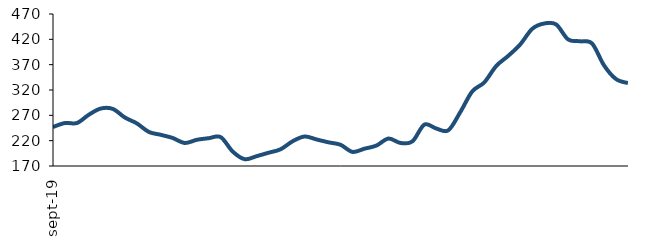
| Category | Series 0 |
|---|---|
| 2019-09-01 | 246.969 |
| 2019-10-01 | 254.848 |
| 2019-11-01 | 254.863 |
| 2019-12-01 | 271.361 |
| 2020-01-01 | 283.496 |
| 2020-02-01 | 282.571 |
| 2020-03-01 | 265.686 |
| 2020-04-01 | 254.092 |
| 2020-05-01 | 237.244 |
| 2020-06-01 | 231.555 |
| 2020-07-01 | 225.236 |
| 2020-08-01 | 215.435 |
| 2020-09-01 | 221.664 |
| 2020-10-01 | 224.87 |
| 2020-11-01 | 226.946 |
| 2020-12-01 | 198.561 |
| 2021-01-01 | 183.435 |
| 2021-02-01 | 189.419 |
| 2021-03-01 | 196.21 |
| 2021-04-01 | 203.011 |
| 2021-05-01 | 218.776 |
| 2021-06-01 | 228.209 |
| 2021-07-01 | 222.41 |
| 2021-08-01 | 216.706 |
| 2021-09-01 | 211.912 |
| 2021-10-01 | 197.858 |
| 2021-11-01 | 204.149 |
| 2021-12-01 | 210.311 |
| 2022-01-01 | 224.106 |
| 2022-02-01 | 215.528 |
| 2022-03-01 | 218.49 |
| 2022-04-01 | 251.637 |
| 2022-05-01 | 243.929 |
| 2022-06-01 | 240.483 |
| 2022-07-01 | 276.323 |
| 2022-08-01 | 317.225 |
| 2022-09-01 | 334.931 |
| 2022-10-01 | 367.369 |
| 2022-11-01 | 387.357 |
| 2022-12-01 | 409.854 |
| 2023-01-01 | 440.564 |
| 2023-02-01 | 451.235 |
| 2023-03-01 | 449.409 |
| 2023-04-01 | 419.821 |
| 2023-05-01 | 416.162 |
| 2023-06-01 | 411.743 |
| 2023-07-01 | 368.527 |
| 2023-08-01 | 341.6 |
| 2023-09-01 | 333.649 |